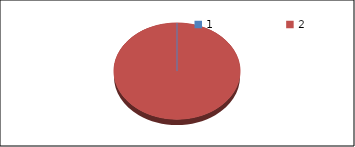
| Category | Series1 |
|---|---|
| 0 | 0 |
| 1 | 49.7 |